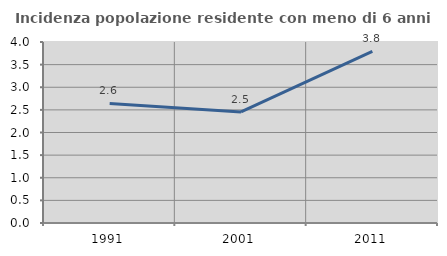
| Category | Incidenza popolazione residente con meno di 6 anni |
|---|---|
| 1991.0 | 2.642 |
| 2001.0 | 2.455 |
| 2011.0 | 3.795 |